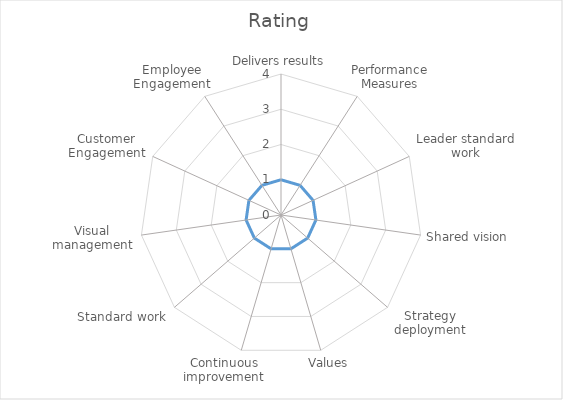
| Category | Rating |
|---|---|
| Delivers results | 1 |
| Performance Measures | 1 |
| Leader standard work | 1 |
| Shared vision | 1 |
| Strategy deployment | 1 |
| Values | 1 |
| Continuous improvement | 1 |
| Standard work | 1 |
| Visual management | 1 |
| Customer Engagement | 1 |
| Employee Engagement | 1 |